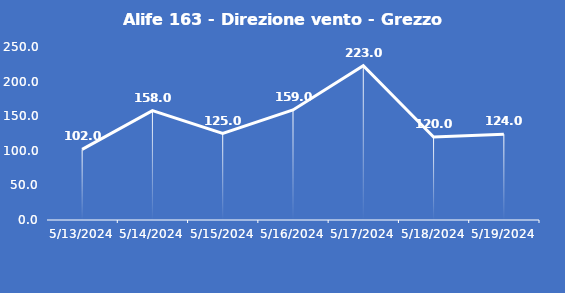
| Category | Alife 163 - Direzione vento - Grezzo (°N) |
|---|---|
| 5/13/24 | 102 |
| 5/14/24 | 158 |
| 5/15/24 | 125 |
| 5/16/24 | 159 |
| 5/17/24 | 223 |
| 5/18/24 | 120 |
| 5/19/24 | 124 |